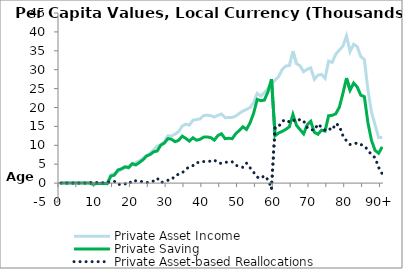
| Category | Private Asset Income | Private Saving | Private Asset-based Reallocations |
|---|---|---|---|
| 0 | 0 | 0.078 | -0.078 |
|  | 0 | -0.133 | 0.133 |
| 2 | 0 | 0 | 0 |
| 3 | 0 | 0.113 | -0.113 |
| 4 | 0 | 0.102 | -0.102 |
| 5 | 0 | 0.14 | -0.14 |
| 6 | 0 | 0.275 | -0.275 |
| 7 | 0 | 1.702 | -1.702 |
| 8 | 0 | 3.42 | -3.42 |
| 9 | 0 | -312.02 | 312.02 |
| 10 | 0 | -135.182 | 135.182 |
| 11 | 0 | -82.79 | 82.79 |
| 12 | 0 | -84.909 | 84.909 |
| 13 | 0 | -142.385 | 142.385 |
| 14 | 2171.924 | 1845.107 | 326.817 |
| 15 | 2571.057 | 2099.96 | 471.096 |
| 16 | 3041.113 | 3469.336 | -428.224 |
| 17 | 3607.097 | 3792.185 | -185.088 |
| 18 | 4104.493 | 4315.945 | -211.452 |
| 19 | 4486.908 | 4072.731 | 414.178 |
| 20 | 5112.365 | 5126.397 | -14.033 |
| 21 | 5428.934 | 4796.332 | 632.602 |
| 22 | 5895.055 | 5451.464 | 443.59 |
| 23 | 6550.597 | 6157.109 | 393.488 |
| 24 | 7258.618 | 7150.974 | 107.644 |
| 25 | 7889.701 | 7549.456 | 340.244 |
| 26 | 8811.246 | 8269.803 | 541.444 |
| 27 | 9784.973 | 8497.273 | 1287.701 |
| 28 | 10196.656 | 10035.851 | 160.805 |
| 29 | 10962.268 | 10587.035 | 375.234 |
| 30 | 12544.029 | 11789.075 | 754.954 |
| 31 | 12454.161 | 11593.5 | 860.661 |
| 32 | 12942.853 | 10949.937 | 1992.915 |
| 33 | 13645.429 | 11317.297 | 2328.133 |
| 34 | 15092.785 | 12414.349 | 2678.436 |
| 35 | 15590.268 | 11837.999 | 3752.27 |
| 36 | 15343.53 | 11101.457 | 4242.074 |
| 37 | 16616.463 | 11988.932 | 4627.531 |
| 38 | 16814.939 | 11351.138 | 5463.801 |
| 39 | 16981.16 | 11577.341 | 5403.819 |
| 40 | 17859.29 | 12158.707 | 5700.583 |
| 41 | 17956.137 | 12222.476 | 5733.661 |
| 42 | 17836.023 | 12020.792 | 5815.231 |
| 43 | 17474.961 | 11364.532 | 6110.429 |
| 44 | 17920.04 | 12586.639 | 5333.401 |
| 45 | 18267.618 | 13055.69 | 5211.928 |
| 46 | 17306.512 | 11752.568 | 5553.944 |
| 47 | 17338.892 | 11855.787 | 5483.105 |
| 48 | 17373.545 | 11751.37 | 5622.175 |
| 49 | 17750.674 | 13074.468 | 4676.206 |
| 50 | 18444.327 | 13939.069 | 4505.258 |
| 51 | 19057.371 | 14910.59 | 4146.781 |
| 52 | 19486.971 | 14204.504 | 5282.466 |
| 53 | 19987.733 | 15943.496 | 4044.237 |
| 54 | 21339.086 | 18497.795 | 2841.291 |
| 55 | 23728.002 | 22143.197 | 1584.805 |
| 56 | 23017.881 | 21800.124 | 1217.757 |
| 57 | 23921.432 | 21950.187 | 1971.245 |
| 58 | 25033.345 | 24147.028 | 886.317 |
| 59 | 26159.874 | 27505.954 | -1346.081 |
| 60 | 27246.204 | 12532.77 | 14713.433 |
| 61 | 28176.508 | 13261.429 | 14915.08 |
| 62 | 30084.007 | 13689.174 | 16394.833 |
| 63 | 30957.613 | 14213.819 | 16743.794 |
| 64 | 31098.109 | 14902.409 | 16195.7 |
| 65 | 34892.874 | 18155.282 | 16737.593 |
| 66 | 31564.606 | 15276.032 | 16288.574 |
| 67 | 31036.489 | 14149.581 | 16886.908 |
| 68 | 29457.427 | 13021.876 | 16435.551 |
| 69 | 30130.671 | 15449.501 | 14681.17 |
| 70 | 30480.07 | 16345.117 | 14134.954 |
| 71 | 27447.32 | 13440.685 | 14006.634 |
| 72 | 28544.234 | 12927.495 | 15616.739 |
| 73 | 28773.108 | 13994.715 | 14778.393 |
| 74 | 27716.682 | 13767.885 | 13948.797 |
| 75 | 32297.31 | 17834.502 | 14462.809 |
| 76 | 31939.908 | 17933.274 | 14006.634 |
| 77 | 34111.525 | 18339.932 | 15771.593 |
| 78 | 35189.229 | 20082.271 | 15106.958 |
| 79 | 36259.058 | 23727.657 | 12531.401 |
| 80 | 38955.964 | 27784.348 | 11171.616 |
| 81 | 34792.596 | 24568.803 | 10223.793 |
| 82 | 36734.904 | 26466.204 | 10268.7 |
| 83 | 36097.541 | 25433.907 | 10663.633 |
| 84 | 33436.623 | 23235.436 | 10201.187 |
| 85 | 32720.284 | 22872.449 | 9847.835 |
| 86 | 24672.044 | 15957.372 | 8714.672 |
| 87 | 18755.118 | 11275.517 | 7479.601 |
| 88 | 15393.386 | 8645.749 | 6747.637 |
| 89 | 12030.974 | 7899.847 | 4131.128 |
| 90+ | 12056.058 | 9591.568 | 2464.49 |